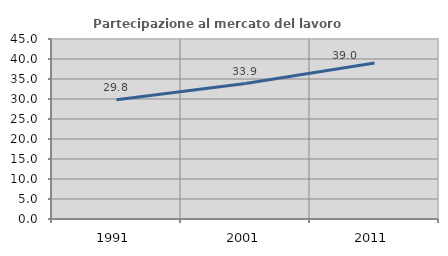
| Category | Partecipazione al mercato del lavoro  femminile |
|---|---|
| 1991.0 | 29.836 |
| 2001.0 | 33.853 |
| 2011.0 | 39.025 |